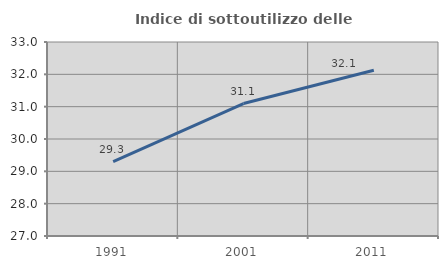
| Category | Indice di sottoutilizzo delle abitazioni  |
|---|---|
| 1991.0 | 29.3 |
| 2001.0 | 31.097 |
| 2011.0 | 32.127 |